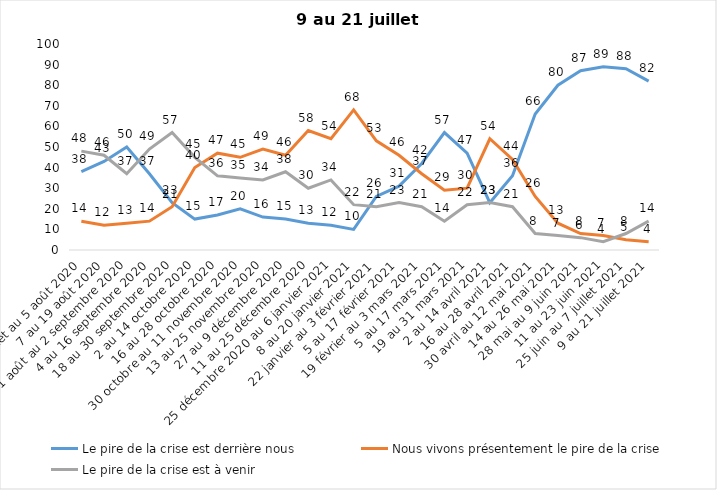
| Category | Le pire de la crise est derrière nous | Nous vivons présentement le pire de la crise | Le pire de la crise est à venir |
|---|---|---|---|
| 24 juillet au 5 août 2020 | 38 | 14 | 48 |
| 7 au 19 août 2020 | 43 | 12 | 46 |
| 21 août au 2 septembre 2020 | 50 | 13 | 37 |
| 4 au 16 septembre 2020 | 37 | 14 | 49 |
| 18 au 30 septembre 2020 | 23 | 21 | 57 |
| 2 au 14 octobre 2020 | 15 | 40 | 45 |
| 16 au 28 octobre 2020 | 17 | 47 | 36 |
| 30 octobre au 11 novembre 2020 | 20 | 45 | 35 |
| 13 au 25 novembre 2020 | 16 | 49 | 34 |
| 27 au 9 décembre 2020 | 15 | 46 | 38 |
| 11 au 25 décembre 2020 | 13 | 58 | 30 |
| 25 décembre 2020 au 6 janvier 2021 | 12 | 54 | 34 |
| 8 au 20 janvier 2021 | 10 | 68 | 22 |
| 22 janvier au 3 février 2021 | 26 | 53 | 21 |
| 5 au 17 février 2021 | 31 | 46 | 23 |
| 19 février au 3 mars 2021 | 42 | 37 | 21 |
| 5 au 17 mars 2021 | 57 | 29 | 14 |
| 19 au 31 mars 2021 | 47 | 30 | 22 |
| 2 au 14 avril 2021 | 23 | 54 | 23 |
| 16 au 28 avril 2021 | 36 | 44 | 21 |
| 30 avril au 12 mai 2021 | 66 | 26 | 8 |
| 14 au 26 mai 2021 | 80 | 13 | 7 |
| 28 mai au 9 juin 2021 | 87 | 8 | 6 |
| 11 au 23 juin 2021 | 89 | 7 | 4 |
| 25 juin au 7 juillet 2021 | 88 | 5 | 8 |
| 9 au 21 juillet 2021 | 82 | 4 | 14 |